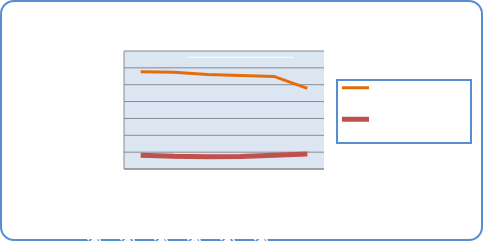
| Category | Motorin Türleri | Benzin Türleri |
|---|---|---|
| 3/25/19 | 57665323.163 | 8226948.778 |
| 3/26/19 | 57359819.65 | 7534835.08 |
| 3/27/19 | 56021135.07 | 7339661.267 |
| 3/28/19 | 55449618.293 | 7446870.296 |
| 3/29/19 | 54902553.247 | 8152895.005 |
| 3/30/19 | 47873648.404 | 8911734.439 |